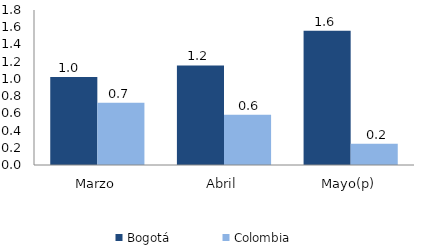
| Category | Bogotá | Colombia |
|---|---|---|
| Marzo | 1.023 | 0.723 |
| Abril | 1.156 | 0.585 |
| Mayo(p) | 1.56 | 0.248 |